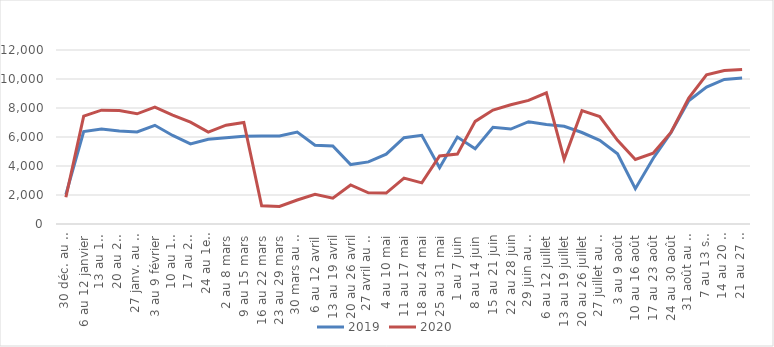
| Category | 2019 | 2020 |
|---|---|---|
| 30 déc. au 5 janvier | 2040 | 1844 |
| 6 au 12 janvier | 6370 | 7440 |
| 13 au 19 janvier | 6554 | 7852 |
| 20 au 26 janvier | 6407 | 7825 |
| 27 janv. au 2 février | 6351 | 7600 |
| 3 au 9 février | 6808 | 8059 |
| 10 au 16 février | 6108 | 7516 |
| 17 au 23 février | 5521 | 7019 |
| 24 au 1er mars | 5849 | 6339 |
| 2 au 8 mars | 5944 | 6814 |
| 9 au 15 mars | 6046 | 7003 |
| 16 au 22 mars | 6069 | 1259 |
| 23 au 29 mars | 6072 | 1215 |
| 30 mars au 5 avril | 6339 | 1654 |
| 6 au 12 avril | 5437 | 2049 |
| 13 au 19 avril | 5376 | 1786 |
| 20 au 26 avril | 4100 | 2690 |
| 27 avril au 3 mai | 4284 | 2149 |
| 4 au 10 mai | 4818 | 2132 |
| 11 au 17 mai | 5953 | 3163 |
| 18 au 24 mai | 6120 | 2836 |
| 25 au 31 mai | 3877 | 4689 |
| 1 au 7 juin | 5999 | 4821 |
| 8 au 14 juin | 5197 | 7078 |
| 15 au 21 juin | 6668 | 7856 |
| 22 au 28 juin | 6548 | 8228 |
| 29 juin au 5 juillet | 7057 | 8523 |
| 6 au 12 juillet | 6862 | 9041 |
| 13 au 19 juillet | 6737 | 4470 |
| 20 au 26 juillet | 6309 | 7820 |
| 27 juillet au 2 août | 5772 | 7408 |
| 3 au 9 août | 4840 | 5773 |
| 10 au 16 août | 2432 | 4454 |
| 17 au 23 août | 4517 | 4882 |
| 24 au 30 août | 6304 | 6315 |
| 31 août au 6 septembre | 8500 | 8683 |
| 7 au 13 septembre | 9436 | 10288 |
| 14 au 20 septembre | 9967 | 10583 |
| 21 au 27 septembre | 10067 | 10651 |